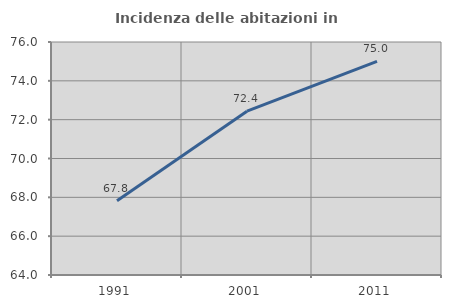
| Category | Incidenza delle abitazioni in proprietà  |
|---|---|
| 1991.0 | 67.823 |
| 2001.0 | 72.437 |
| 2011.0 | 75 |